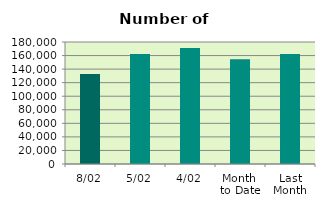
| Category | Series 0 |
|---|---|
| 8/02 | 132934 |
| 5/02 | 162344 |
| 4/02 | 171314 |
| Month 
to Date | 154670.667 |
| Last
Month | 162275.9 |